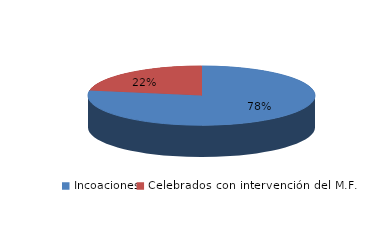
| Category | Series 0 |
|---|---|
| Incoaciones | 7025 |
| Celebrados con intervención del M.F. | 2013 |